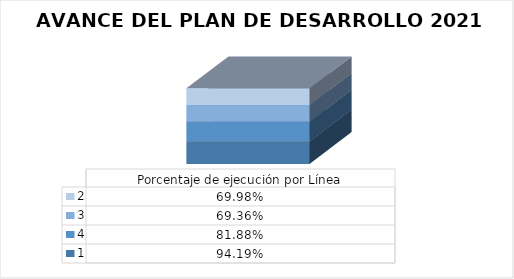
| Category | 1 | 4 | 3 | 2 |
|---|---|---|---|---|
| 0 | 0.942 | 0.819 | 0.694 | 0.7 |